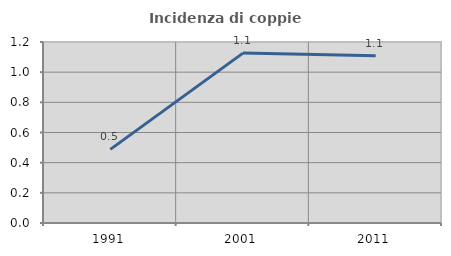
| Category | Incidenza di coppie miste |
|---|---|
| 1991.0 | 0.488 |
| 2001.0 | 1.126 |
| 2011.0 | 1.109 |